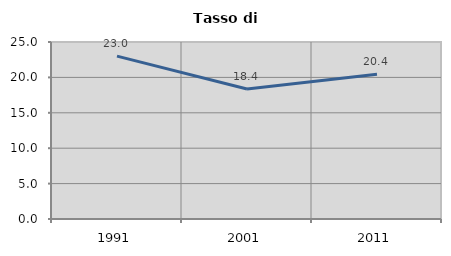
| Category | Tasso di disoccupazione   |
|---|---|
| 1991.0 | 23.005 |
| 2001.0 | 18.351 |
| 2011.0 | 20.433 |